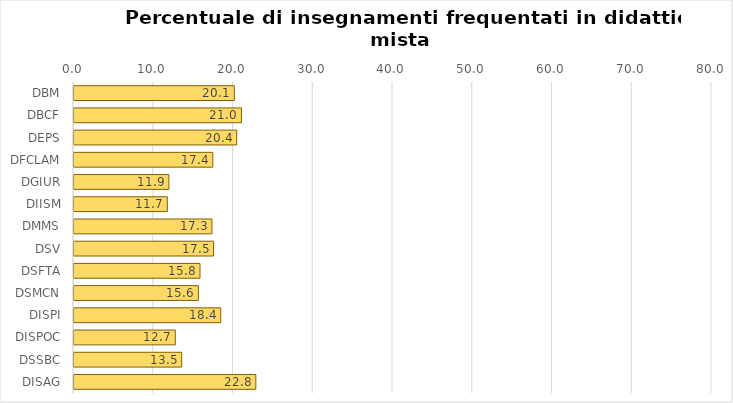
| Category | Series 0 |
|---|---|
| DBM | 20.1 |
| DBCF | 21 |
| DEPS | 20.4 |
| DFCLAM | 17.4 |
| DGIUR | 11.9 |
| DIISM | 11.7 |
| DMMS | 17.3 |
| DSV | 17.5 |
| DSFTA | 15.8 |
| DSMCN | 15.6 |
| DISPI | 18.4 |
| DISPOC | 12.7 |
| DSSBC | 13.5 |
| DISAG | 22.8 |